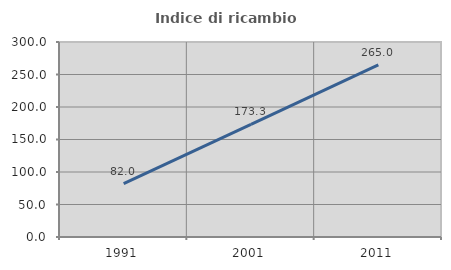
| Category | Indice di ricambio occupazionale  |
|---|---|
| 1991.0 | 82.042 |
| 2001.0 | 173.333 |
| 2011.0 | 264.964 |